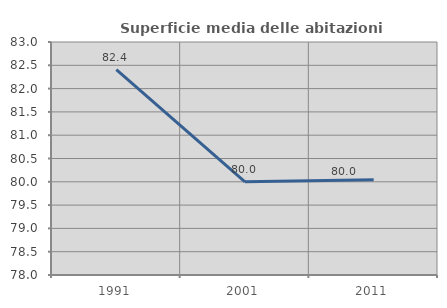
| Category | Superficie media delle abitazioni occupate |
|---|---|
| 1991.0 | 82.406 |
| 2001.0 | 80 |
| 2011.0 | 80.043 |